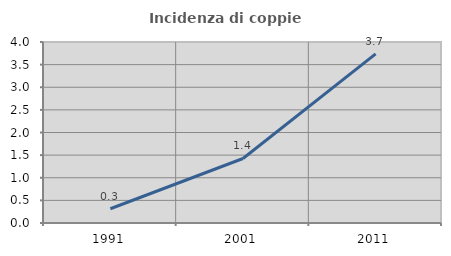
| Category | Incidenza di coppie miste |
|---|---|
| 1991.0 | 0.315 |
| 2001.0 | 1.425 |
| 2011.0 | 3.737 |